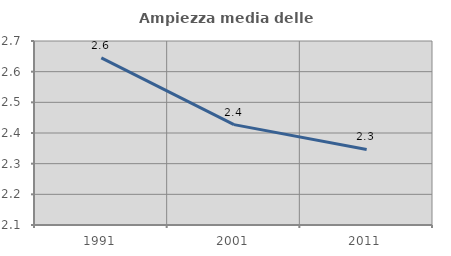
| Category | Ampiezza media delle famiglie |
|---|---|
| 1991.0 | 2.645 |
| 2001.0 | 2.427 |
| 2011.0 | 2.347 |